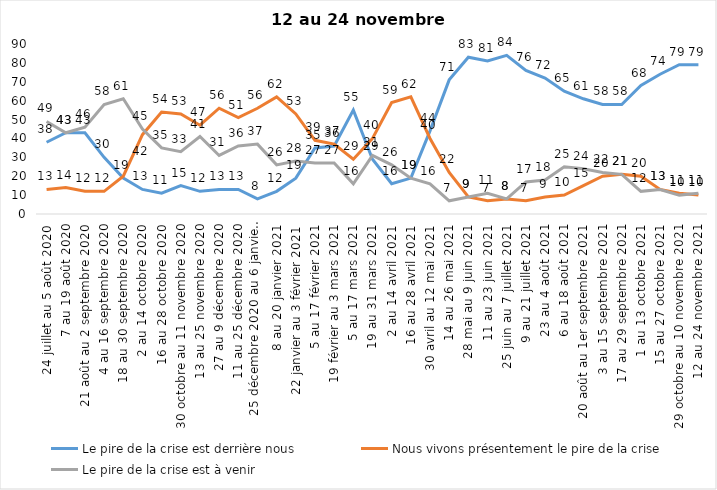
| Category | Le pire de la crise est derrière nous | Nous vivons présentement le pire de la crise | Le pire de la crise est à venir |
|---|---|---|---|
| 24 juillet au 5 août 2020 | 38 | 13 | 49 |
| 7 au 19 août 2020 | 43 | 14 | 43 |
| 21 août au 2 septembre 2020 | 43 | 12 | 46 |
| 4 au 16 septembre 2020 | 30 | 12 | 58 |
| 18 au 30 septembre 2020 | 19 | 20 | 61 |
| 2 au 14 octobre 2020 | 13 | 42 | 45 |
| 16 au 28 octobre 2020 | 11 | 54 | 35 |
| 30 octobre au 11 novembre 2020 | 15 | 53 | 33 |
| 13 au 25 novembre 2020 | 12 | 47 | 41 |
| 27 au 9 décembre 2020 | 13 | 56 | 31 |
| 11 au 25 décembre 2020 | 13 | 51 | 36 |
| 25 décembre 2020 au 6 janvier 2021 | 8 | 56 | 37 |
| 8 au 20 janvier 2021 | 12 | 62 | 26 |
| 22 janvier au 3 février 2021 | 19 | 53 | 28 |
| 5 au 17 février 2021 | 35 | 39 | 27 |
| 19 février au 3 mars 2021 | 36 | 37 | 27 |
| 5 au 17 mars 2021 | 55 | 29 | 16 |
| 19 au 31 mars 2021 | 29 | 40 | 31 |
| 2 au 14 avril 2021 | 16 | 59 | 26 |
| 16 au 28 avril 2021 | 19 | 62 | 19 |
| 30 avril au 12 mai 2021 | 44 | 40 | 16 |
| 14 au 26 mai 2021 | 71 | 22 | 7 |
| 28 mai au 9 juin 2021 | 83 | 9 | 9 |
| 11 au 23 juin 2021 | 81 | 7 | 11 |
| 25 juin au 7 juillet 2021 | 84 | 8 | 8 |
| 9 au 21 juillet 2021 | 76 | 7 | 17 |
| 23 au 4 août 2021 | 72 | 9 | 18 |
| 6 au 18 août 2021 | 65 | 10 | 25 |
| 20 août au 1er septembre 2021 | 61 | 15 | 24 |
| 3 au 15 septembre 2021 | 58 | 20 | 22 |
| 17 au 29 septembre 2021 | 58 | 21 | 21 |
| 1 au 13 octobre 2021 | 68 | 20 | 12 |
| 15 au 27 octobre 2021 | 74 | 13 | 13 |
| 29 octobre au 10 novembre 2021 | 79 | 11 | 10 |
| 12 au 24 novembre 2021 | 79 | 10 | 11 |